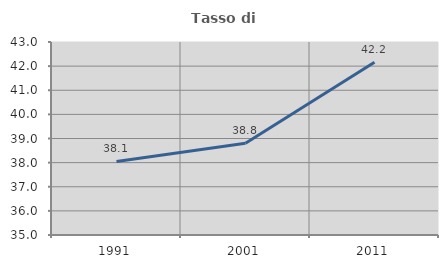
| Category | Tasso di occupazione   |
|---|---|
| 1991.0 | 38.051 |
| 2001.0 | 38.803 |
| 2011.0 | 42.163 |